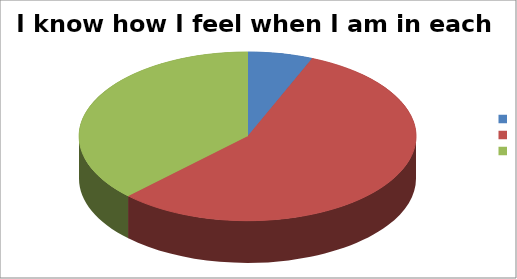
| Category | I know how I feel when I am in each zone |
|---|---|
|  | 2 |
|  | 18 |
|  | 12 |